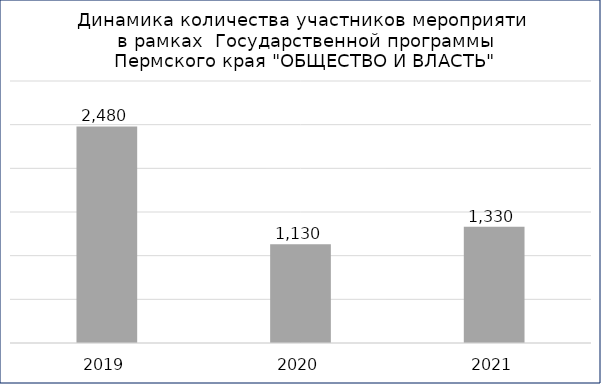
| Category | Количество участников |
|---|---|
| 2019.0 | 2480 |
| 2020.0 | 1130 |
| 2021.0 | 1330 |